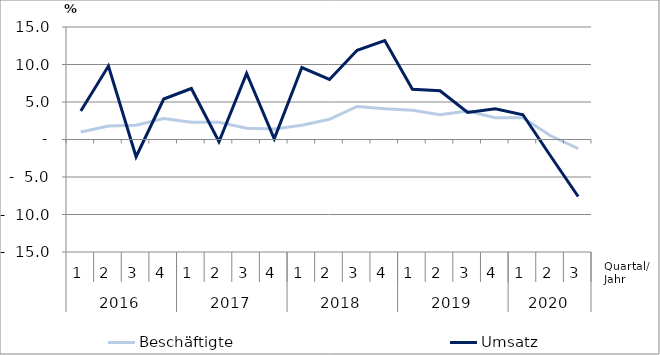
| Category | Beschäftigte | Umsatz |
|---|---|---|
| 0 | 1 | 3.8 |
| 1 | 1.8 | 9.8 |
| 2 | 1.9 | -2.3 |
| 3 | 2.8 | 5.4 |
| 4 | 2.3 | 6.8 |
| 5 | 2.3 | -0.3 |
| 6 | 1.5 | 8.8 |
| 7 | 1.4 | 0.1 |
| 8 | 1.9 | 9.6 |
| 9 | 2.7 | 8 |
| 10 | 4.4 | 11.9 |
| 11 | 4.1 | 13.2 |
| 12 | 3.9 | 6.7 |
| 13 | 3.3 | 6.5 |
| 14 | 3.8 | 3.6 |
| 15 | 2.9 | 4.1 |
| 16 | 2.9 | 3.3 |
| 17 | 0.5 | -2.2 |
| 18 | -1.2 | -7.6 |